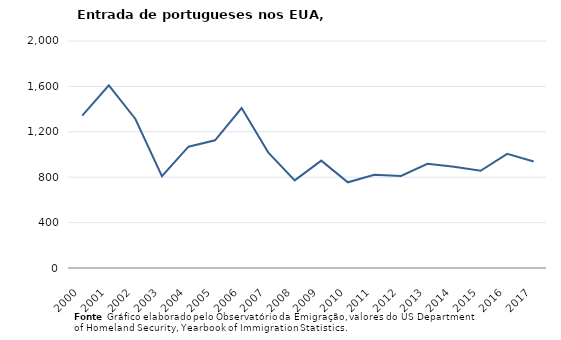
| Category | Entradas de portugueses |
|---|---|
| 2000.0 | 1343 |
| 2001.0 | 1609 |
| 2002.0 | 1313 |
| 2003.0 | 808 |
| 2004.0 | 1069 |
| 2005.0 | 1125 |
| 2006.0 | 1409 |
| 2007.0 | 1019 |
| 2008.0 | 772 |
| 2009.0 | 946 |
| 2010.0 | 755 |
| 2011.0 | 821 |
| 2012.0 | 811 |
| 2013.0 | 918 |
| 2014.0 | 892 |
| 2015.0 | 857 |
| 2016.0 | 1006 |
| 2017.0 | 939 |